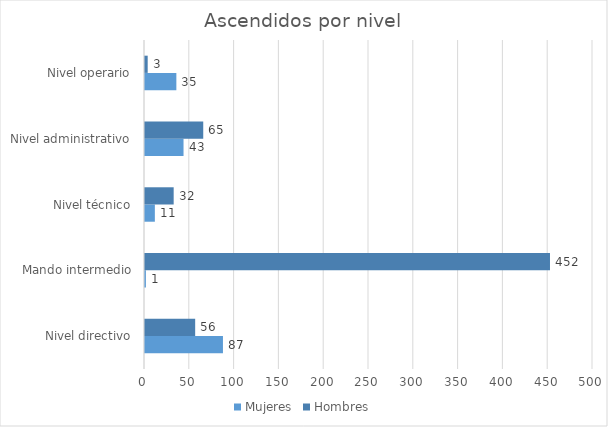
| Category | Mujeres | Hombres |
|---|---|---|
| Nivel directivo | 87 | 56 |
| Mando intermedio | 1 | 452 |
| Nivel técnico | 11 | 32 |
| Nivel administrativo | 43 | 65 |
| Nivel operario | 35 | 3 |